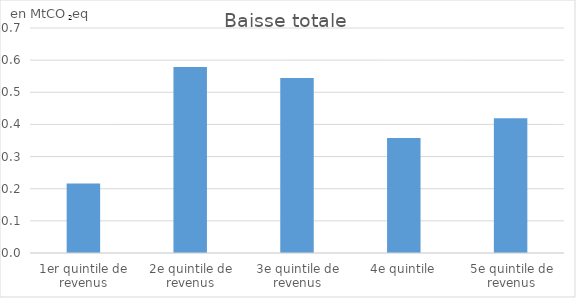
| Category | Baisse totale |
|---|---|
| 1er quintile de revenus | 0.216 |
| 2e quintile de revenus | 0.579 |
| 3e quintile de revenus | 0.544 |
| 4e quintile | 0.358 |
| 5e quintile de revenus | 0.419 |